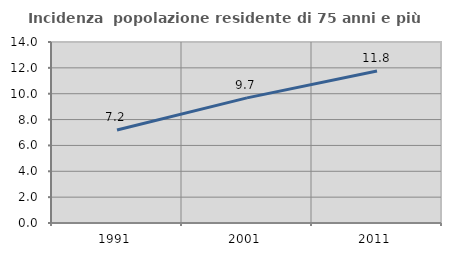
| Category | Incidenza  popolazione residente di 75 anni e più |
|---|---|
| 1991.0 | 7.198 |
| 2001.0 | 9.677 |
| 2011.0 | 11.76 |